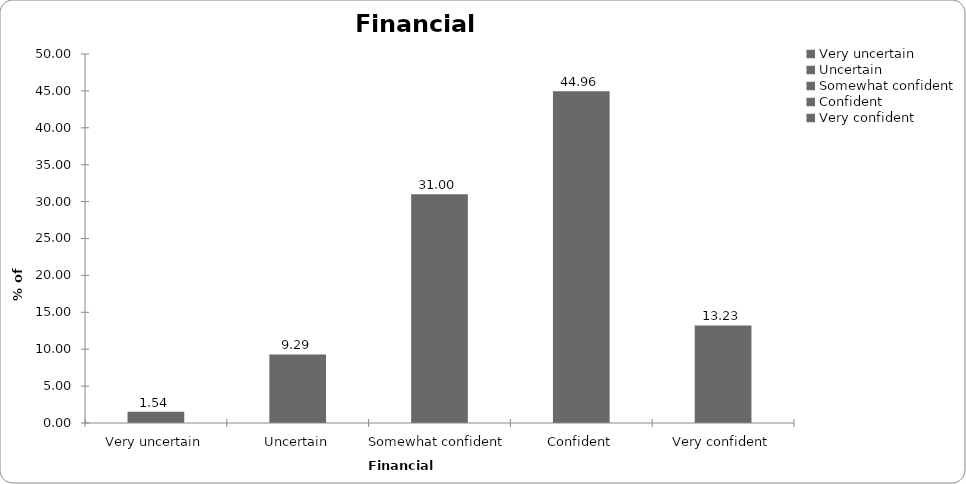
| Category | Financial confidence |
|---|---|
| Very uncertain | 1.536 |
| Uncertain | 9.285 |
| Somewhat confident | 30.995 |
| Confident | 44.957 |
| Very confident | 13.226 |